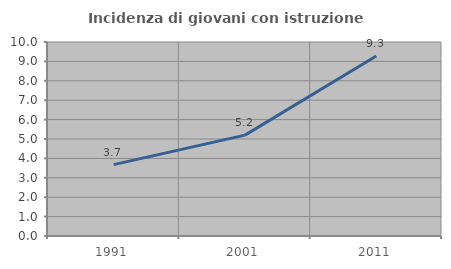
| Category | Incidenza di giovani con istruzione universitaria |
|---|---|
| 1991.0 | 3.681 |
| 2001.0 | 5.201 |
| 2011.0 | 9.283 |